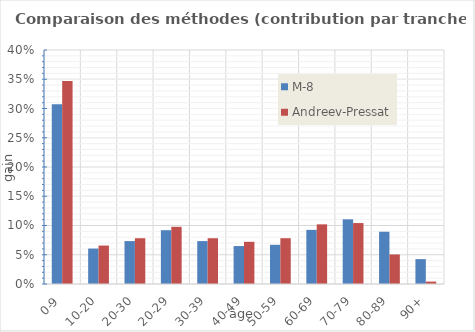
| Category | M-8 | Andreev-Pressat |
|---|---|---|
| 0-9 | 0.307 | 0.347 |
| 10-20 | 0.061 | 0.066 |
| 20-30 | 0.073 | 0.078 |
| 20-29 | 0.092 | 0.098 |
| 30-39 | 0.073 | 0.078 |
| 40-49 | 0.065 | 0.072 |
| 50-59 | 0.067 | 0.078 |
| 60-69 | 0.093 | 0.102 |
| 70-79 | 0.111 | 0.104 |
| 80-89 | 0.089 | 0.051 |
| 90+ | 0.043 | 0.004 |